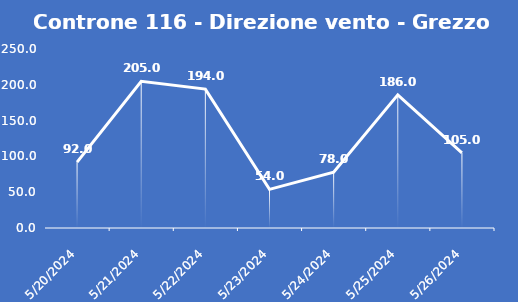
| Category | Controne 116 - Direzione vento - Grezzo (°N) |
|---|---|
| 5/20/24 | 92 |
| 5/21/24 | 205 |
| 5/22/24 | 194 |
| 5/23/24 | 54 |
| 5/24/24 | 78 |
| 5/25/24 | 186 |
| 5/26/24 | 105 |